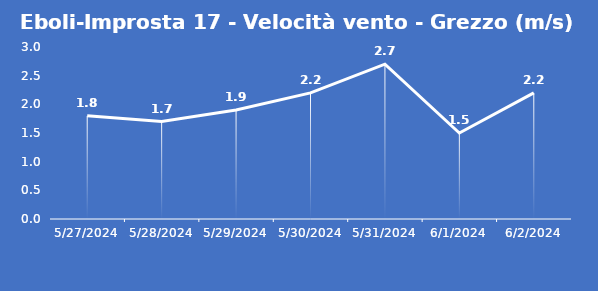
| Category | Eboli-Improsta 17 - Velocità vento - Grezzo (m/s) |
|---|---|
| 5/27/24 | 1.8 |
| 5/28/24 | 1.7 |
| 5/29/24 | 1.9 |
| 5/30/24 | 2.2 |
| 5/31/24 | 2.7 |
| 6/1/24 | 1.5 |
| 6/2/24 | 2.2 |